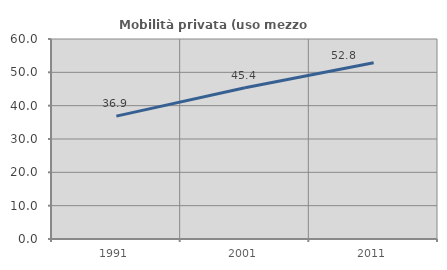
| Category | Mobilità privata (uso mezzo privato) |
|---|---|
| 1991.0 | 36.858 |
| 2001.0 | 45.379 |
| 2011.0 | 52.849 |